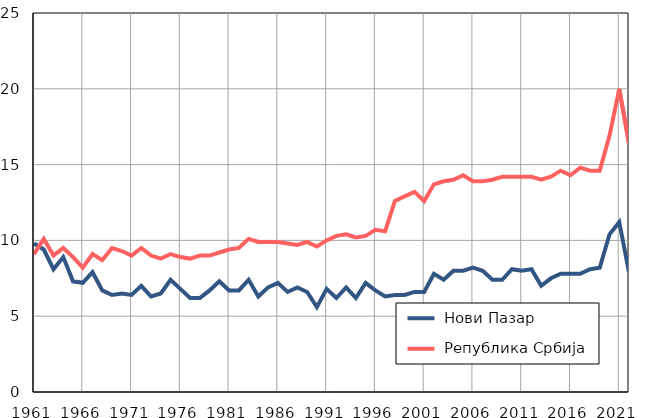
| Category |  Нови Пазар |  Република Србија |
|---|---|---|
| 1961.0 | 9.8 | 9.1 |
| 1962.0 | 9.4 | 10.1 |
| 1963.0 | 8.1 | 9 |
| 1964.0 | 8.9 | 9.5 |
| 1965.0 | 7.3 | 8.9 |
| 1966.0 | 7.2 | 8.2 |
| 1967.0 | 7.9 | 9.1 |
| 1968.0 | 6.7 | 8.7 |
| 1969.0 | 6.4 | 9.5 |
| 1970.0 | 6.5 | 9.3 |
| 1971.0 | 6.4 | 9 |
| 1972.0 | 7 | 9.5 |
| 1973.0 | 6.3 | 9 |
| 1974.0 | 6.5 | 8.8 |
| 1975.0 | 7.4 | 9.1 |
| 1976.0 | 6.8 | 8.9 |
| 1977.0 | 6.2 | 8.8 |
| 1978.0 | 6.2 | 9 |
| 1979.0 | 6.7 | 9 |
| 1980.0 | 7.3 | 9.2 |
| 1981.0 | 6.7 | 9.4 |
| 1982.0 | 6.7 | 9.5 |
| 1983.0 | 7.4 | 10.1 |
| 1984.0 | 6.3 | 9.9 |
| 1985.0 | 6.9 | 9.9 |
| 1986.0 | 7.2 | 9.9 |
| 1987.0 | 6.6 | 9.8 |
| 1988.0 | 6.9 | 9.7 |
| 1989.0 | 6.6 | 9.9 |
| 1990.0 | 5.6 | 9.6 |
| 1991.0 | 6.8 | 10 |
| 1992.0 | 6.2 | 10.3 |
| 1993.0 | 6.9 | 10.4 |
| 1994.0 | 6.2 | 10.2 |
| 1995.0 | 7.2 | 10.3 |
| 1996.0 | 6.7 | 10.7 |
| 1997.0 | 6.3 | 10.6 |
| 1998.0 | 6.4 | 12.6 |
| 1999.0 | 6.4 | 12.9 |
| 2000.0 | 6.6 | 13.2 |
| 2001.0 | 6.6 | 12.6 |
| 2002.0 | 7.8 | 13.7 |
| 2003.0 | 7.4 | 13.9 |
| 2004.0 | 8 | 14 |
| 2005.0 | 8 | 14.3 |
| 2006.0 | 8.2 | 13.9 |
| 2007.0 | 8 | 13.9 |
| 2008.0 | 7.4 | 14 |
| 2009.0 | 7.4 | 14.2 |
| 2010.0 | 8.1 | 14.2 |
| 2011.0 | 8 | 14.2 |
| 2012.0 | 8.1 | 14.2 |
| 2013.0 | 7 | 14 |
| 2014.0 | 7.5 | 14.2 |
| 2015.0 | 7.8 | 14.6 |
| 2016.0 | 7.8 | 14.3 |
| 2017.0 | 7.8 | 14.8 |
| 2018.0 | 8.1 | 14.6 |
| 2019.0 | 8.2 | 14.6 |
| 2020.0 | 10.4 | 16.9 |
| 2021.0 | 11.2 | 20 |
| 2022.0 | 7.9 | 16.4 |